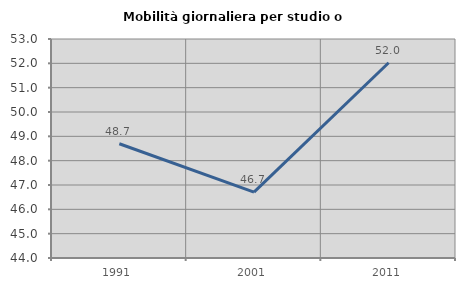
| Category | Mobilità giornaliera per studio o lavoro |
|---|---|
| 1991.0 | 48.694 |
| 2001.0 | 46.705 |
| 2011.0 | 52.025 |